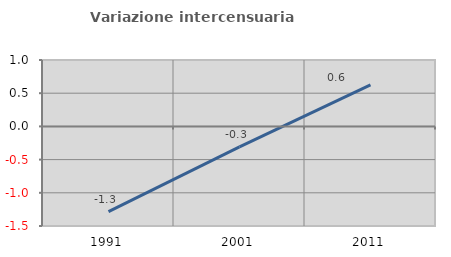
| Category | Variazione intercensuaria annua |
|---|---|
| 1991.0 | -1.282 |
| 2001.0 | -0.309 |
| 2011.0 | 0.625 |